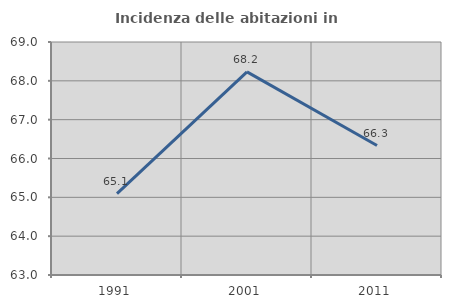
| Category | Incidenza delle abitazioni in proprietà  |
|---|---|
| 1991.0 | 65.094 |
| 2001.0 | 68.232 |
| 2011.0 | 66.334 |